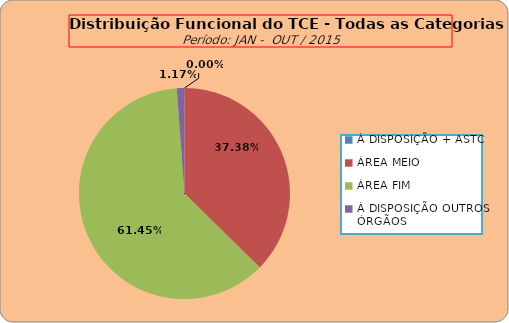
| Category | Series 0 |
|---|---|
| À DISPOSIÇÃO + ASTC | 0 |
| ÁREA MEIO | 191 |
| ÁREA FIM | 314 |
| À DISPOSIÇÃO OUTROS ÓRGÃOS | 6 |